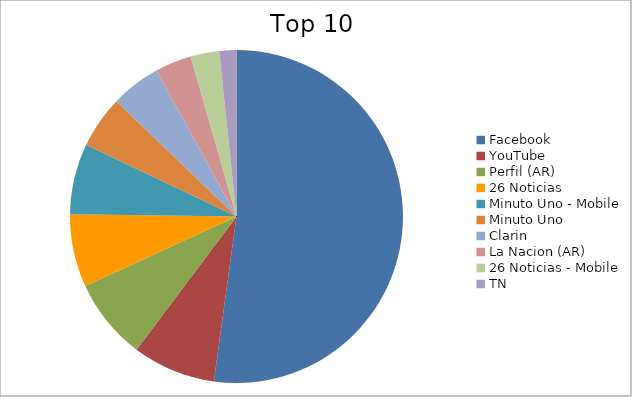
| Category | Series 0 |
|---|---|
| Facebook | 41.43 |
| YouTube | 6.41 |
| Perfil (AR) | 6.27 |
| 26 Noticias | 5.62 |
| Minuto Uno - Mobile | 5.45 |
| Minuto Uno | 4.05 |
| Clarin | 3.84 |
| La Nacion (AR) | 2.81 |
| 26 Noticias - Mobile | 2.21 |
| TN | 1.32 |